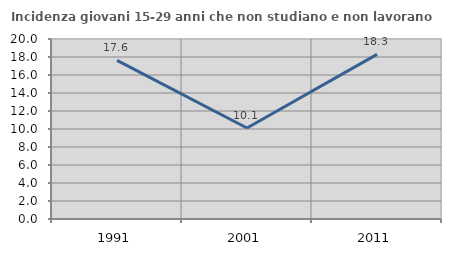
| Category | Incidenza giovani 15-29 anni che non studiano e non lavorano  |
|---|---|
| 1991.0 | 17.617 |
| 2001.0 | 10.112 |
| 2011.0 | 18.293 |